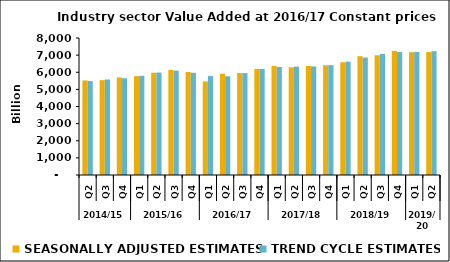
| Category | SEASONALLY ADJUSTED ESTIMATES | TREND CYCLE ESTIMATES |
|---|---|---|
| 0 | 5521.171 | 5485.787 |
| 1 | 5538.423 | 5577.334 |
| 2 | 5699.391 | 5648.025 |
| 3 | 5770.151 | 5790.937 |
| 4 | 5973.374 | 5982.095 |
| 5 | 6133.49 | 6092.747 |
| 6 | 6012.301 | 5967.155 |
| 7 | 5464.771 | 5775.471 |
| 8 | 5914.946 | 5763.8 |
| 9 | 5954.097 | 5949.837 |
| 10 | 6193.621 | 6194.884 |
| 11 | 6363.673 | 6313.158 |
| 12 | 6286.497 | 6325.184 |
| 13 | 6364.35 | 6339.273 |
| 14 | 6406.663 | 6416.026 |
| 15 | 6583.272 | 6618.509 |
| 16 | 6936.456 | 6858.006 |
| 17 | 6992.88 | 7063.577 |
| 18 | 7244.713 | 7177.269 |
| 19 | 7171.531 | 7185.727 |
| 20 | 7178.738 | 7228.627 |